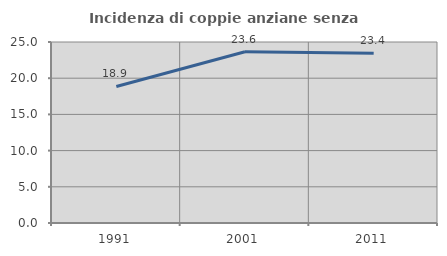
| Category | Incidenza di coppie anziane senza figli  |
|---|---|
| 1991.0 | 18.854 |
| 2001.0 | 23.649 |
| 2011.0 | 23.442 |